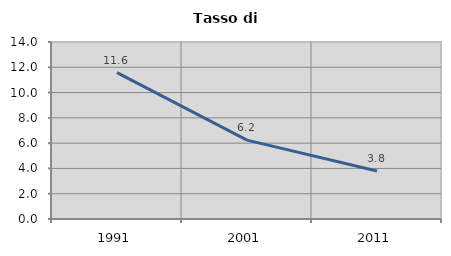
| Category | Tasso di disoccupazione   |
|---|---|
| 1991.0 | 11.572 |
| 2001.0 | 6.237 |
| 2011.0 | 3.797 |